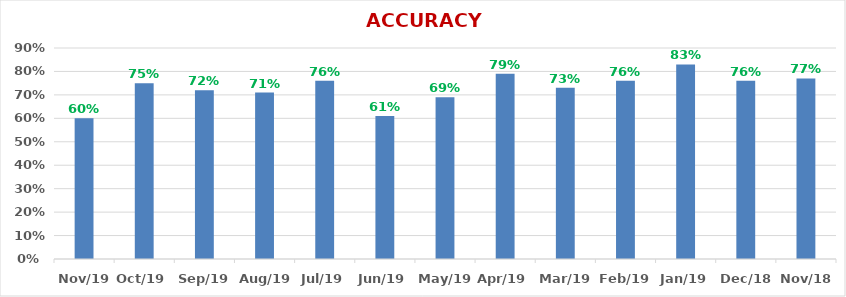
| Category | ACCURACY |
|---|---|
| 2019-11-01 | 0.6 |
| 2019-10-01 | 0.75 |
| 2019-09-01 | 0.72 |
| 2019-08-01 | 0.71 |
| 2019-07-01 | 0.76 |
| 2019-06-01 | 0.61 |
| 2019-05-01 | 0.69 |
| 2019-04-01 | 0.79 |
| 2019-03-01 | 0.73 |
| 2019-02-01 | 0.76 |
| 2019-01-01 | 0.83 |
| 2018-12-01 | 0.76 |
| 2018-11-01 | 0.77 |